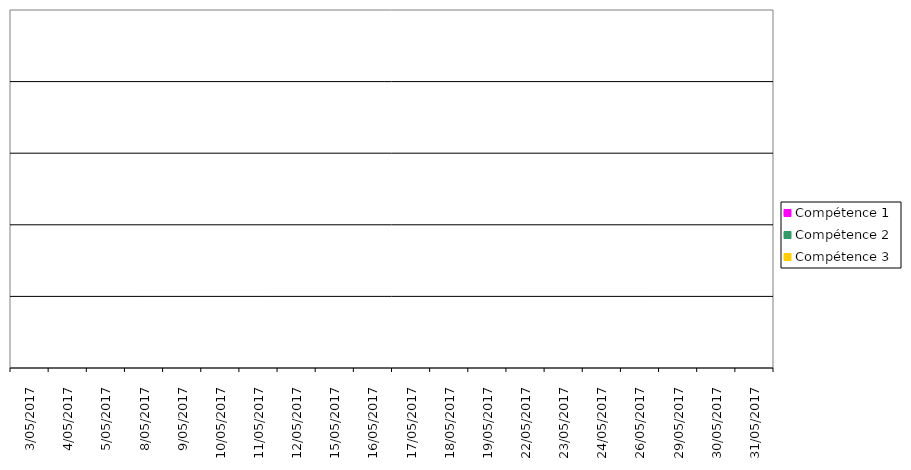
| Category | Compétence 1 | Compétence 2 | Compétence 3 |
|---|---|---|---|
| 3-05-2017 | 0 | 0 | 0 |
| 4-05-2017 | 0 | 0 | 0 |
| 5-05-2017 | 0 | 0 | 0 |
| 8-05-2017 | 0 | 0 | 0 |
| 9-05-2017 | 0 | 0 | 0 |
| 10-05-2017 | 0 | 0 | 0 |
| 11-05-2017 | 0 | 0 | 0 |
| 12-05-2017 | 0 | 0 | 0 |
| 15-05-2017 | 0 | 0 | 0 |
| 16-05-2017 | 0 | 0 | 0 |
| 17-05-2017 | 0 | 0 | 0 |
| 18-05-2017 | 0 | 0 | 0 |
| 19-05-2017 | 0 | 0 | 0 |
| 22-05-2017 | 0 | 0 | 0 |
| 23-05-2017 | 0 | 0 | 0 |
| 24-05-2017 | 0 | 0 | 0 |
| 26-05-2017 | 0 | 0 | 0 |
| 29-05-2017 | 0 | 0 | 0 |
| 30-05-2017 | 0 | 0 | 0 |
| 31-05-2017 | 0 | 0 | 0 |